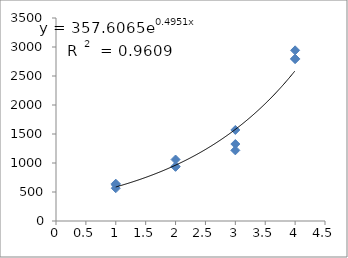
| Category | Series 0 |
|---|---|
| 1.0 | 565.219 |
| 1.0 | 643.555 |
| 1.0 | 624.272 |
| 2.0 | 1059.583 |
| 2.0 | 933.513 |
| 2.0 | 942.518 |
| 3.0 | 1218.146 |
| 3.0 | 1569.724 |
| 3.0 | 1327.086 |
| 4.0 | 2799.061 |
| 4.0 | 2942.395 |
| 4.0 | 2790.948 |